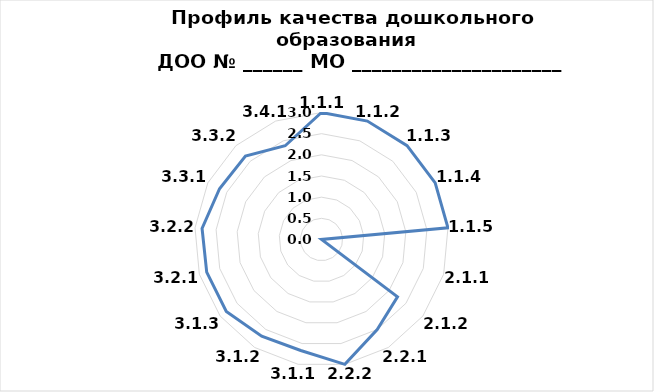
| Category | Series 0 |
|---|---|
| 1.1.1 | 3 |
| 1.1.2 | 3 |
| 1.1.3 | 3 |
| 1.1.4 | 3 |
| 1.1.5 | 3 |
| 2.1.1 | 0 |
| 2.1.2 | 2.25 |
| 2.2.1 | 2.5 |
| 2.2.2 | 3 |
| 3.1.1 | 2.667 |
| 3.1.2 | 2.684 |
| 3.1.3 | 2.818 |
| 3.2.1 | 2.819 |
| 3.2.2 | 2.833 |
| 3.3.1 | 2.691 |
| 3.3.2 | 2.667 |
| 3.4.1 | 2.375 |